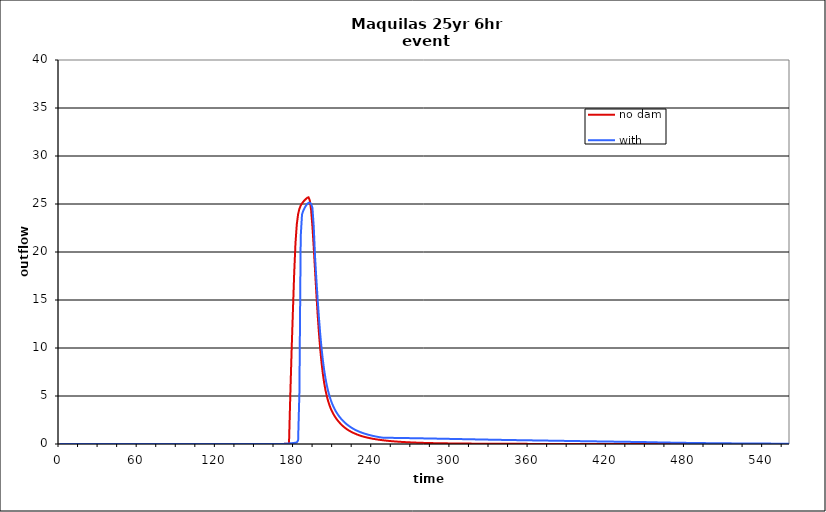
| Category | no dam | with dam |
|---|---|---|
| 0.0 | 0 | 0 |
| 1.0 | 0 | 0 |
| 2.0 | 0 | 0 |
| 3.0 | 0 | 0 |
| 4.0 | 0 | 0 |
| 5.0 | 0 | 0 |
| 6.0 | 0 | 0 |
| 7.0 | 0 | 0 |
| 8.0 | 0 | 0 |
| 9.0 | 0 | 0 |
| 10.0 | 0 | 0 |
| 11.0 | 0 | 0 |
| 12.0 | 0 | 0 |
| 13.0 | 0 | 0 |
| 14.0 | 0 | 0 |
| 15.0 | 0 | 0 |
| 16.0 | 0 | 0 |
| 17.0 | 0 | 0 |
| 18.0 | 0 | 0 |
| 19.0 | 0 | 0 |
| 20.0 | 0 | 0 |
| 21.0 | 0 | 0 |
| 22.0 | 0 | 0 |
| 23.0 | 0 | 0 |
| 24.0 | 0 | 0 |
| 25.0 | 0 | 0 |
| 26.0 | 0 | 0 |
| 27.0 | 0 | 0 |
| 28.0 | 0 | 0 |
| 29.0 | 0 | 0 |
| 30.0 | 0 | 0 |
| 31.0 | 0 | 0 |
| 32.0 | 0 | 0 |
| 33.0 | 0 | 0 |
| 34.0 | 0 | 0 |
| 35.0 | 0 | 0 |
| 36.0 | 0 | 0 |
| 37.0 | 0 | 0 |
| 38.0 | 0 | 0 |
| 39.0 | 0 | 0 |
| 40.0 | 0 | 0 |
| 41.0 | 0 | 0 |
| 42.0 | 0 | 0 |
| 43.0 | 0 | 0 |
| 44.0 | 0 | 0 |
| 45.0 | 0 | 0 |
| 46.0 | 0 | 0 |
| 47.0 | 0 | 0 |
| 48.0 | 0 | 0 |
| 49.0 | 0 | 0 |
| 50.0 | 0 | 0 |
| 51.0 | 0 | 0 |
| 52.0 | 0 | 0 |
| 53.0 | 0 | 0 |
| 54.0 | 0 | 0 |
| 55.0 | 0 | 0 |
| 56.0 | 0 | 0 |
| 57.0 | 0 | 0 |
| 58.0 | 0 | 0 |
| 59.0 | 0 | 0 |
| 60.0 | 0 | 0 |
| 61.0 | 0 | 0 |
| 62.0 | 0 | 0 |
| 63.0 | 0 | 0 |
| 64.0 | 0 | 0 |
| 65.0 | 0 | 0 |
| 66.0 | 0 | 0 |
| 67.0 | 0 | 0 |
| 68.0 | 0 | 0 |
| 69.0 | 0 | 0 |
| 70.0 | 0 | 0 |
| 71.0 | 0 | 0 |
| 72.0 | 0 | 0 |
| 73.0 | 0 | 0 |
| 74.0 | 0 | 0 |
| 75.0 | 0 | 0 |
| 76.0 | 0 | 0 |
| 77.0 | 0 | 0 |
| 78.0 | 0 | 0 |
| 79.0 | 0 | 0 |
| 80.0 | 0 | 0 |
| 81.0 | 0 | 0 |
| 82.0 | 0 | 0 |
| 83.0 | 0 | 0 |
| 84.0 | 0 | 0 |
| 85.0 | 0 | 0 |
| 86.0 | 0 | 0 |
| 87.0 | 0 | 0 |
| 88.0 | 0 | 0 |
| 89.0 | 0 | 0 |
| 90.0 | 0 | 0 |
| 91.0 | 0 | 0 |
| 92.0 | 0 | 0 |
| 93.0 | 0 | 0 |
| 94.0 | 0 | 0 |
| 95.0 | 0 | 0 |
| 96.0 | 0 | 0 |
| 97.0 | 0 | 0 |
| 98.0 | 0 | 0 |
| 99.0 | 0 | 0 |
| 100.0 | 0 | 0 |
| 101.0 | 0 | 0 |
| 102.0 | 0 | 0 |
| 103.0 | 0 | 0 |
| 104.0 | 0 | 0 |
| 105.0 | 0 | 0 |
| 106.0 | 0 | 0 |
| 107.0 | 0 | 0 |
| 108.0 | 0 | 0 |
| 109.0 | 0 | 0 |
| 110.0 | 0 | 0 |
| 111.0 | 0 | 0 |
| 112.0 | 0 | 0 |
| 113.0 | 0 | 0 |
| 114.0 | 0 | 0 |
| 115.0 | 0 | 0 |
| 116.0 | 0 | 0 |
| 117.0 | 0 | 0 |
| 118.0 | 0 | 0 |
| 119.0 | 0 | 0 |
| 120.0 | 0 | 0 |
| 121.0 | 0 | 0 |
| 122.0 | 0 | 0 |
| 123.0 | 0 | 0 |
| 124.0 | 0 | 0 |
| 125.0 | 0 | 0 |
| 126.0 | 0 | 0 |
| 127.0 | 0 | 0 |
| 128.0 | 0 | 0 |
| 129.0 | 0 | 0 |
| 130.0 | 0 | 0 |
| 131.0 | 0 | 0 |
| 132.0 | 0 | 0 |
| 133.0 | 0 | 0 |
| 134.0 | 0 | 0 |
| 135.0 | 0 | 0 |
| 136.0 | 0 | 0 |
| 137.0 | 0 | 0 |
| 138.0 | 0 | 0 |
| 139.0 | 0 | 0 |
| 140.0 | 0 | 0 |
| 141.0 | 0 | 0 |
| 142.0 | 0 | 0 |
| 143.0 | 0 | 0 |
| 144.0 | 0 | 0 |
| 145.0 | 0 | 0 |
| 146.0 | 0 | 0 |
| 147.0 | 0 | 0 |
| 148.0 | 0 | 0 |
| 149.0 | 0 | 0 |
| 150.0 | 0 | 0 |
| 151.0 | 0 | 0 |
| 152.0 | 0 | 0 |
| 153.0 | 0 | 0 |
| 154.0 | 0 | 0 |
| 155.0 | 0 | 0 |
| 156.0 | 0 | 0 |
| 157.0 | 0 | 0 |
| 158.0 | 0 | 0 |
| 159.0 | 0 | 0 |
| 160.0 | 0 | 0 |
| 161.0 | 0 | 0 |
| 162.0 | 0 | 0 |
| 163.0 | 0 | 0 |
| 164.0 | 0 | 0 |
| 165.0 | 0 | 0 |
| 166.0 | 0.001 | 0.001 |
| 167.0 | 0.001 | 0.001 |
| 168.0 | 0.001 | 0.001 |
| 169.0 | 0.002 | 0.002 |
| 170.0 | 0.002 | 0.002 |
| 171.0 | 0.004 | 0.004 |
| 172.0 | 0.011 | 0.011 |
| 173.0 | 0.022 | 0.021 |
| 174.0 | 0.024 | 0.031 |
| 175.0 | 0.004 | 0.043 |
| 176.0 | 0 | 0.055 |
| 177.0 | 5.038 | 0.068 |
| 178.0 | 9.651 | 0.081 |
| 179.0 | 13.793 | 0.097 |
| 180.0 | 17.8 | 0.116 |
| 181.0 | 20.957 | 0.131 |
| 182.0 | 22.888 | 0.173 |
| 183.0 | 23.941 | 0.374 |
| 184.0 | 24.508 | 5.389 |
| 185.0 | 24.841 | 21.593 |
| 186.0 | 25.067 | 23.914 |
| 187.0 | 25.244 | 24.319 |
| 188.0 | 25.394 | 24.594 |
| 189.0 | 25.528 | 24.821 |
| 190.0 | 25.646 | 25.014 |
| 191.0 | 25.697 | 25.131 |
| 192.0 | 25.372 | 25.135 |
| 193.0 | 24.346 | 25.011 |
| 194.0 | 22.632 | 24.59 |
| 195.0 | 20.46 | 22.63 |
| 196.0 | 18.076 | 19.512 |
| 197.0 | 15.699 | 17.205 |
| 198.0 | 13.486 | 15.069 |
| 199.0 | 11.525 | 13.131 |
| 200.0 | 9.846 | 11.424 |
| 201.0 | 8.452 | 9.962 |
| 202.0 | 7.3 | 8.732 |
| 203.0 | 6.366 | 7.699 |
| 204.0 | 5.612 | 6.842 |
| 205.0 | 4.996 | 6.133 |
| 206.0 | 4.487 | 5.538 |
| 207.0 | 4.063 | 5.036 |
| 208.0 | 3.707 | 4.607 |
| 209.0 | 3.404 | 4.238 |
| 210.0 | 3.142 | 3.919 |
| 211.0 | 2.91 | 3.641 |
| 212.0 | 2.702 | 3.393 |
| 213.0 | 2.516 | 3.172 |
| 214.0 | 2.347 | 2.973 |
| 215.0 | 2.193 | 2.793 |
| 216.0 | 2.049 | 2.628 |
| 217.0 | 1.916 | 2.477 |
| 218.0 | 1.795 | 2.339 |
| 219.0 | 1.684 | 2.211 |
| 220.0 | 1.582 | 2.093 |
| 221.0 | 1.488 | 1.984 |
| 222.0 | 1.403 | 1.882 |
| 223.0 | 1.325 | 1.787 |
| 224.0 | 1.252 | 1.698 |
| 225.0 | 1.185 | 1.614 |
| 226.0 | 1.121 | 1.536 |
| 227.0 | 1.061 | 1.465 |
| 228.0 | 1.004 | 1.398 |
| 229.0 | 0.951 | 1.337 |
| 230.0 | 0.902 | 1.28 |
| 231.0 | 0.856 | 1.226 |
| 232.0 | 0.814 | 1.175 |
| 233.0 | 0.775 | 1.127 |
| 234.0 | 0.738 | 1.082 |
| 235.0 | 0.703 | 1.04 |
| 236.0 | 0.671 | 1 |
| 237.0 | 0.64 | 0.962 |
| 238.0 | 0.61 | 0.926 |
| 239.0 | 0.582 | 0.892 |
| 240.0 | 0.556 | 0.86 |
| 241.0 | 0.531 | 0.829 |
| 242.0 | 0.507 | 0.8 |
| 243.0 | 0.485 | 0.772 |
| 244.0 | 0.464 | 0.746 |
| 245.0 | 0.445 | 0.72 |
| 246.0 | 0.426 | 0.697 |
| 247.0 | 0.408 | 0.676 |
| 248.0 | 0.391 | 0.66 |
| 249.0 | 0.375 | 0.652 |
| 250.0 | 0.359 | 0.649 |
| 251.0 | 0.345 | 0.647 |
| 252.0 | 0.331 | 0.645 |
| 253.0 | 0.317 | 0.643 |
| 254.0 | 0.305 | 0.642 |
| 255.0 | 0.293 | 0.64 |
| 256.0 | 0.281 | 0.638 |
| 257.0 | 0.271 | 0.636 |
| 258.0 | 0.26 | 0.634 |
| 259.0 | 0.25 | 0.632 |
| 260.0 | 0.241 | 0.63 |
| 261.0 | 0.231 | 0.628 |
| 262.0 | 0.222 | 0.626 |
| 263.0 | 0.214 | 0.624 |
| 264.0 | 0.206 | 0.622 |
| 265.0 | 0.198 | 0.62 |
| 266.0 | 0.19 | 0.617 |
| 267.0 | 0.183 | 0.615 |
| 268.0 | 0.176 | 0.613 |
| 269.0 | 0.17 | 0.611 |
| 270.0 | 0.164 | 0.608 |
| 271.0 | 0.158 | 0.606 |
| 272.0 | 0.152 | 0.604 |
| 273.0 | 0.147 | 0.601 |
| 274.0 | 0.142 | 0.599 |
| 275.0 | 0.136 | 0.596 |
| 276.0 | 0.132 | 0.594 |
| 277.0 | 0.127 | 0.591 |
| 278.0 | 0.123 | 0.589 |
| 279.0 | 0.118 | 0.586 |
| 280.0 | 0.114 | 0.584 |
| 281.0 | 0.11 | 0.581 |
| 282.0 | 0.106 | 0.579 |
| 283.0 | 0.103 | 0.576 |
| 284.0 | 0.1 | 0.574 |
| 285.0 | 0.096 | 0.571 |
| 286.0 | 0.093 | 0.568 |
| 287.0 | 0.09 | 0.566 |
| 288.0 | 0.087 | 0.563 |
| 289.0 | 0.085 | 0.561 |
| 290.0 | 0.082 | 0.558 |
| 291.0 | 0.08 | 0.555 |
| 292.0 | 0.077 | 0.553 |
| 293.0 | 0.075 | 0.55 |
| 294.0 | 0.073 | 0.547 |
| 295.0 | 0.07 | 0.545 |
| 296.0 | 0.068 | 0.542 |
| 297.0 | 0.066 | 0.54 |
| 298.0 | 0.064 | 0.537 |
| 299.0 | 0.063 | 0.534 |
| 300.0 | 0.061 | 0.532 |
| 301.0 | 0.059 | 0.529 |
| 302.0 | 0.057 | 0.526 |
| 303.0 | 0.056 | 0.524 |
| 304.0 | 0.054 | 0.521 |
| 305.0 | 0.053 | 0.518 |
| 306.0 | 0.051 | 0.516 |
| 307.0 | 0.05 | 0.513 |
| 308.0 | 0.048 | 0.51 |
| 309.0 | 0.047 | 0.508 |
| 310.0 | 0.046 | 0.505 |
| 311.0 | 0.045 | 0.502 |
| 312.0 | 0.043 | 0.5 |
| 313.0 | 0.042 | 0.497 |
| 314.0 | 0.041 | 0.494 |
| 315.0 | 0.04 | 0.492 |
| 316.0 | 0.039 | 0.489 |
| 317.0 | 0.038 | 0.487 |
| 318.0 | 0.037 | 0.484 |
| 319.0 | 0.036 | 0.481 |
| 320.0 | 0.035 | 0.479 |
| 321.0 | 0.034 | 0.476 |
| 322.0 | 0.033 | 0.473 |
| 323.0 | 0.032 | 0.471 |
| 324.0 | 0.031 | 0.468 |
| 325.0 | 0.031 | 0.466 |
| 326.0 | 0.03 | 0.463 |
| 327.0 | 0.029 | 0.46 |
| 328.0 | 0.028 | 0.458 |
| 329.0 | 0.028 | 0.455 |
| 330.0 | 0.027 | 0.453 |
| 331.0 | 0.026 | 0.45 |
| 332.0 | 0.026 | 0.447 |
| 333.0 | 0.025 | 0.445 |
| 334.0 | 0.024 | 0.442 |
| 335.0 | 0.024 | 0.44 |
| 336.0 | 0.023 | 0.437 |
| 337.0 | 0.022 | 0.434 |
| 338.0 | 0.022 | 0.432 |
| 339.0 | 0.021 | 0.429 |
| 340.0 | 0.021 | 0.427 |
| 341.0 | 0.02 | 0.424 |
| 342.0 | 0.02 | 0.422 |
| 343.0 | 0.019 | 0.42 |
| 344.0 | 0.019 | 0.418 |
| 345.0 | 0.018 | 0.416 |
| 346.0 | 0.018 | 0.414 |
| 347.0 | 0.018 | 0.411 |
| 348.0 | 0.017 | 0.409 |
| 349.0 | 0.017 | 0.407 |
| 350.0 | 0.016 | 0.405 |
| 351.0 | 0.016 | 0.403 |
| 352.0 | 0.015 | 0.401 |
| 353.0 | 0.015 | 0.398 |
| 354.0 | 0.015 | 0.396 |
| 355.0 | 0.014 | 0.394 |
| 356.0 | 0.014 | 0.392 |
| 357.0 | 0.014 | 0.39 |
| 358.0 | 0.013 | 0.388 |
| 359.0 | 0.013 | 0.386 |
| 360.0 | 0.013 | 0.383 |
| 361.0 | 0.012 | 0.381 |
| 362.0 | 0.012 | 0.379 |
| 363.0 | 0.012 | 0.377 |
| 364.0 | 0.011 | 0.375 |
| 365.0 | 0.011 | 0.373 |
| 366.0 | 0.011 | 0.371 |
| 367.0 | 0.01 | 0.368 |
| 368.0 | 0.01 | 0.366 |
| 369.0 | 0.01 | 0.364 |
| 370.0 | 0.01 | 0.362 |
| 371.0 | 0.009 | 0.36 |
| 372.0 | 0.009 | 0.358 |
| 373.0 | 0.009 | 0.356 |
| 374.0 | 0.008 | 0.353 |
| 375.0 | 0.008 | 0.351 |
| 376.0 | 0.008 | 0.349 |
| 377.0 | 0.008 | 0.347 |
| 378.0 | 0.007 | 0.345 |
| 379.0 | 0.007 | 0.343 |
| 380.0 | 0.007 | 0.341 |
| 381.0 | 0.006 | 0.339 |
| 382.0 | 0.006 | 0.336 |
| 383.0 | 0.006 | 0.334 |
| 384.0 | 0.006 | 0.332 |
| 385.0 | 0.005 | 0.33 |
| 386.0 | 0.005 | 0.328 |
| 387.0 | 0.005 | 0.326 |
| 388.0 | 0.005 | 0.324 |
| 389.0 | 0.004 | 0.322 |
| 390.0 | 0.004 | 0.319 |
| 391.0 | 0.004 | 0.317 |
| 392.0 | 0.004 | 0.315 |
| 393.0 | 0.003 | 0.313 |
| 394.0 | 0.003 | 0.311 |
| 395.0 | 0.003 | 0.309 |
| 396.0 | 0.003 | 0.307 |
| 397.0 | 0.003 | 0.305 |
| 398.0 | 0.002 | 0.303 |
| 399.0 | 0.002 | 0.301 |
| 400.0 | 0.002 | 0.298 |
| 401.0 | 0.002 | 0.296 |
| 402.0 | 0.002 | 0.294 |
| 403.0 | 0.001 | 0.292 |
| 404.0 | 0.001 | 0.29 |
| 405.0 | 0.001 | 0.288 |
| 406.0 | 0.001 | 0.286 |
| 407.0 | 0.001 | 0.284 |
| 408.0 | 0.001 | 0.282 |
| 409.0 | 0.001 | 0.28 |
| 410.0 | 0.001 | 0.278 |
| 411.0 | 0.001 | 0.276 |
| 412.0 | 0.001 | 0.274 |
| 413.0 | 0 | 0.272 |
| 414.0 | 0 | 0.27 |
| 415.0 | 0 | 0.268 |
| 416.0 | 0 | 0.266 |
| 417.0 | 0 | 0.264 |
| 418.0 | 0 | 0.262 |
| 419.0 | 0 | 0.259 |
| 420.0 | 0 | 0.257 |
| 421.0 | 0 | 0.255 |
| 422.0 | 0 | 0.253 |
| 423.0 | 0 | 0.251 |
| 424.0 | 0 | 0.249 |
| 425.0 | 0 | 0.247 |
| 426.0 | 0 | 0.245 |
| 427.0 | 0 | 0.243 |
| 428.0 | 0 | 0.241 |
| 429.0 | 0 | 0.239 |
| 430.0 | 0 | 0.237 |
| 431.0 | 0 | 0.235 |
| 432.0 | 0 | 0.234 |
| 433.0 | 0 | 0.232 |
| 434.0 | 0 | 0.23 |
| 435.0 | 0 | 0.228 |
| 436.0 | 0 | 0.226 |
| 437.0 | 0 | 0.224 |
| 438.0 | 0 | 0.222 |
| 439.0 | 0 | 0.22 |
| 440.0 | 0 | 0.218 |
| 441.0 | 0 | 0.216 |
| 442.0 | 0 | 0.214 |
| 443.0 | 0 | 0.212 |
| 444.0 | 0 | 0.21 |
| 445.0 | 0 | 0.208 |
| 446.0 | 0 | 0.206 |
| 447.0 | 0 | 0.204 |
| 448.0 | 0 | 0.202 |
| 449.0 | 0 | 0.199 |
| 450.0 | 0 | 0.196 |
| 451.0 | 0 | 0.193 |
| 452.0 | 0 | 0.19 |
| 453.0 | 0 | 0.187 |
| 454.0 | 0 | 0.184 |
| 455.0 | 0 | 0.181 |
| 456.0 | 0 | 0.178 |
| 457.0 | 0 | 0.175 |
| 458.0 | 0 | 0.172 |
| 459.0 | 0 | 0.169 |
| 460.0 | 0 | 0.166 |
| 461.0 | 0 | 0.163 |
| 462.0 | 0 | 0.161 |
| 463.0 | 0 | 0.158 |
| 464.0 | 0 | 0.155 |
| 465.0 | 0 | 0.153 |
| 466.0 | 0 | 0.15 |
| 467.0 | 0 | 0.148 |
| 468.0 | 0 | 0.145 |
| 469.0 | 0 | 0.143 |
| 470.0 | 0 | 0.14 |
| 471.0 | 0 | 0.138 |
| 472.0 | 0 | 0.136 |
| 473.0 | 0 | 0.134 |
| 474.0 | 0 | 0.131 |
| 475.0 | 0 | 0.129 |
| 476.0 | 0 | 0.127 |
| 477.0 | 0 | 0.125 |
| 478.0 | 0 | 0.123 |
| 479.0 | 0 | 0.121 |
| 480.0 | 0 | 0.119 |
| 481.0 | 0 | 0.117 |
| 482.0 | 0 | 0.115 |
| 483.0 | 0 | 0.113 |
| 484.0 | 0 | 0.111 |
| 485.0 | 0 | 0.109 |
| 486.0 | 0 | 0.107 |
| 487.0 | 0 | 0.106 |
| 488.0 | 0 | 0.104 |
| 489.0 | 0 | 0.102 |
| 490.0 | 0 | 0.1 |
| 491.0 | 0 | 0.099 |
| 492.0 | 0 | 0.097 |
| 493.0 | 0 | 0.095 |
| 494.0 | 0 | 0.094 |
| 495.0 | 0 | 0.092 |
| 496.0 | 0 | 0.091 |
| 497.0 | 0 | 0.089 |
| 498.0 | 0 | 0.088 |
| 499.0 | 0 | 0.086 |
| 500.0 | 0 | 0.085 |
| 501.0 | 0 | 0.083 |
| 502.0 | 0 | 0.082 |
| 503.0 | 0 | 0.081 |
| 504.0 | 0 | 0.079 |
| 505.0 | 0 | 0.078 |
| 506.0 | 0 | 0.077 |
| 507.0 | 0 | 0.075 |
| 508.0 | 0 | 0.074 |
| 509.0 | 0 | 0.073 |
| 510.0 | 0 | 0.072 |
| 511.0 | 0 | 0.07 |
| 512.0 | 0 | 0.069 |
| 513.0 | 0 | 0.068 |
| 514.0 | 0 | 0.067 |
| 515.0 | 0 | 0.066 |
| 516.0 | 0 | 0.065 |
| 517.0 | 0 | 0.064 |
| 518.0 | 0 | 0.062 |
| 519.0 | 0 | 0.061 |
| 520.0 | 0 | 0.06 |
| 521.0 | 0 | 0.059 |
| 522.0 | 0 | 0.058 |
| 523.0 | 0 | 0.057 |
| 524.0 | 0 | 0.056 |
| 525.0 | 0 | 0.056 |
| 526.0 | 0 | 0.055 |
| 527.0 | 0 | 0.054 |
| 528.0 | 0 | 0.053 |
| 529.0 | 0 | 0.052 |
| 530.0 | 0 | 0.051 |
| 531.0 | 0 | 0.05 |
| 532.0 | 0 | 0.049 |
| 533.0 | 0 | 0.048 |
| 534.0 | 0 | 0.048 |
| 535.0 | 0 | 0.047 |
| 536.0 | 0 | 0.046 |
| 537.0 | 0 | 0.045 |
| 538.0 | 0 | 0.044 |
| 539.0 | 0 | 0.044 |
| 540.0 | 0 | 0.043 |
| 541.0 | 0 | 0.042 |
| 542.0 | 0 | 0.042 |
| 543.0 | 0 | 0.041 |
| 544.0 | 0 | 0.04 |
| 545.0 | 0 | 0.039 |
| 546.0 | 0 | 0.039 |
| 547.0 | 0 | 0.038 |
| 548.0 | 0 | 0.037 |
| 549.0 | 0 | 0.037 |
| 550.0 | 0 | 0.036 |
| 551.0 | 0 | 0.036 |
| 552.0 | 0 | 0.035 |
| 553.0 | 0 | 0.034 |
| 554.0 | 0 | 0.034 |
| 555.0 | 0 | 0.033 |
| 556.0 | 0 | 0.033 |
| 557.0 | 0 | 0.032 |
| 558.0 | 0 | 0.032 |
| 559.0 | 0 | 0.031 |
| 560.0 | 0 | 0.03 |